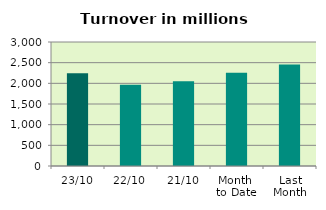
| Category | Series 0 |
|---|---|
| 23/10 | 2244.413 |
| 22/10 | 1963.017 |
| 21/10 | 2050.728 |
| Month 
to Date | 2255.246 |
| Last
Month | 2458.207 |